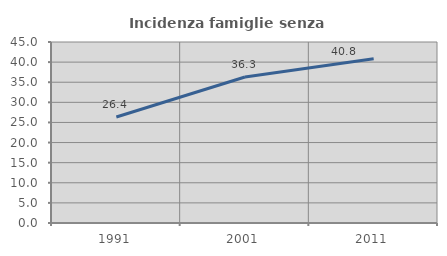
| Category | Incidenza famiglie senza nuclei |
|---|---|
| 1991.0 | 26.357 |
| 2001.0 | 36.303 |
| 2011.0 | 40.837 |